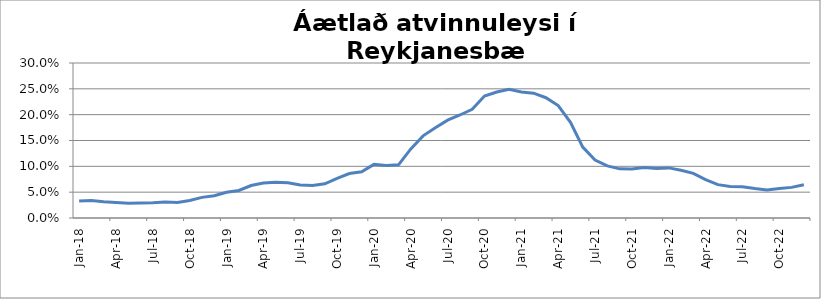
| Category | Series 0 |
|---|---|
| 2018-01-01 | 0.033 |
| 2018-02-01 | 0.034 |
| 2018-03-01 | 0.031 |
| 2018-04-01 | 0.03 |
| 2018-05-01 | 0.028 |
| 2018-06-01 | 0.029 |
| 2018-07-01 | 0.03 |
| 2018-08-01 | 0.031 |
| 2018-09-01 | 0.03 |
| 2018-10-01 | 0.034 |
| 2018-11-01 | 0.04 |
| 2018-12-01 | 0.043 |
| 2019-01-01 | 0.05 |
| 2019-02-01 | 0.053 |
| 2019-03-01 | 0.063 |
| 2019-04-01 | 0.068 |
| 2019-05-01 | 0.069 |
| 2019-06-01 | 0.068 |
| 2019-07-01 | 0.064 |
| 2019-08-01 | 0.063 |
| 2019-09-01 | 0.066 |
| 2019-10-01 | 0.077 |
| 2019-11-01 | 0.086 |
| 2019-12-01 | 0.089 |
| 2020-01-01 | 0.104 |
| 2020-02-01 | 0.102 |
| 2020-03-01 | 0.103 |
| 2020-04-01 | 0.134 |
| 2020-05-01 | 0.159 |
| 2020-06-01 | 0.175 |
| 2020-07-01 | 0.189 |
| 2020-08-01 | 0.199 |
| 2020-09-01 | 0.21 |
| 2020-10-01 | 0.236 |
| 2020-11-01 | 0.244 |
| 2020-12-01 | 0.249 |
| 2021-01-01 | 0.244 |
| 2021-02-01 | 0.242 |
| 2021-03-01 | 0.233 |
| 2021-04-01 | 0.218 |
| 2021-05-01 | 0.185 |
| 2021-06-01 | 0.137 |
| 2021-07-01 | 0.112 |
| 2021-08-01 | 0.101 |
| 2021-09-01 | 0.095 |
| 2021-10-01 | 0.095 |
| 2021-11-01 | 0.098 |
| 2021-12-01 | 0.096 |
| 2022-01-01 | 0.097 |
| 2022-02-01 | 0.092 |
| 2022-03-01 | 0.086 |
| 2022-04-01 | 0.074 |
| 2022-05-01 | 0.065 |
| 2022-06-01 | 0.061 |
| 2022-07-01 | 0.06 |
| 2022-08-01 | 0.057 |
| 2022-09-01 | 0.054 |
| 2022-10-01 | 0.057 |
| 2022-11-01 | 0.059 |
| 2022-12-01 | 0.064 |